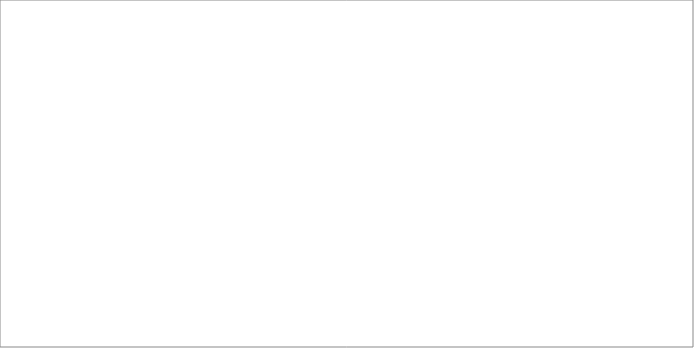
| Category | 2008 | 2009 | 2010 | 2011 | 2012 | 2013 |
|---|---|---|---|---|---|---|
| mazowieckie | 815 | 1927 | 1084 | 179 | 125 | 91 |